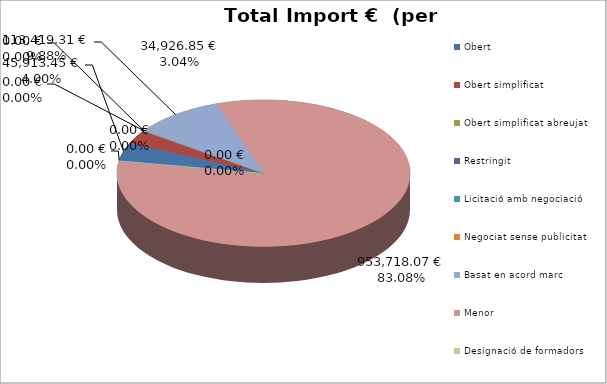
| Category | Total preu              (amb iva) |
|---|---|
| Obert | 45913.45 |
| Obert simplificat | 34926.85 |
| Obert simplificat abreujat | 0 |
| Restringit | 0 |
| Licitació amb negociació | 0 |
| Negociat sense publicitat | 0 |
| Basat en acord marc | 113419.31 |
| Menor | 953718.07 |
| Designació de formadors | 0 |